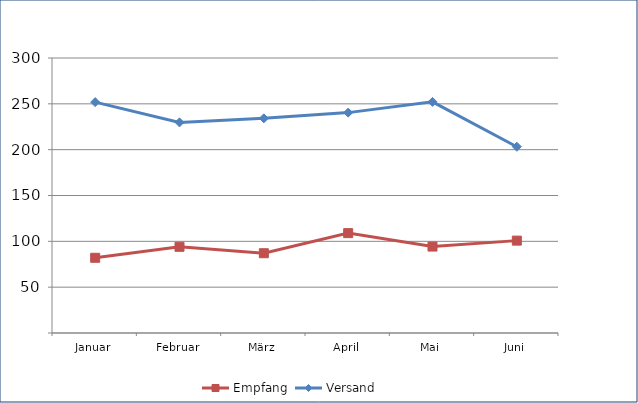
| Category | Empfang | Versand |
|---|---|---|
| Januar | 82.045 | 251.859 |
| Februar | 94.025 | 229.767 |
| März | 87.018 | 234.172 |
| April | 108.951 | 240.418 |
| Mai | 94.287 | 252.129 |
| Juni | 100.774 | 203.194 |